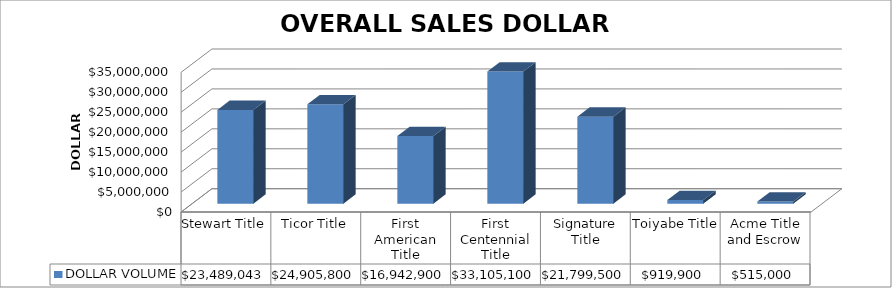
| Category | DOLLAR VOLUME |
|---|---|
| Stewart Title | 23489043 |
| Ticor Title | 24905800 |
| First American Title | 16942900 |
| First Centennial Title | 33105100 |
| Signature Title | 21799500 |
| Toiyabe Title | 919900 |
| Acme Title and Escrow | 515000 |